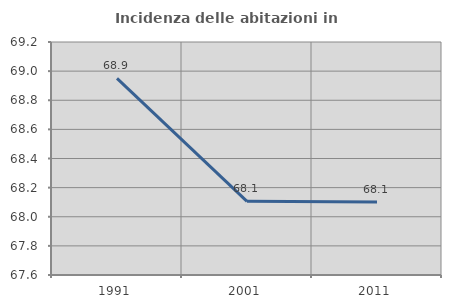
| Category | Incidenza delle abitazioni in proprietà  |
|---|---|
| 1991.0 | 68.95 |
| 2001.0 | 68.106 |
| 2011.0 | 68.101 |